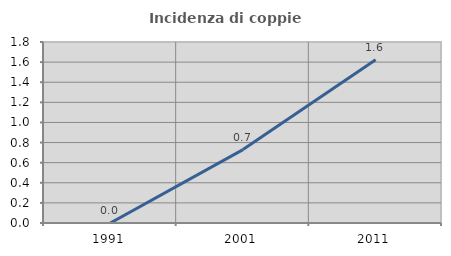
| Category | Incidenza di coppie miste |
|---|---|
| 1991.0 | 0 |
| 2001.0 | 0.73 |
| 2011.0 | 1.623 |